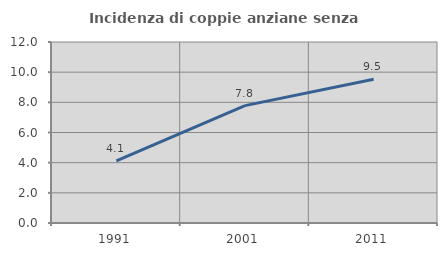
| Category | Incidenza di coppie anziane senza figli  |
|---|---|
| 1991.0 | 4.111 |
| 2001.0 | 7.783 |
| 2011.0 | 9.534 |